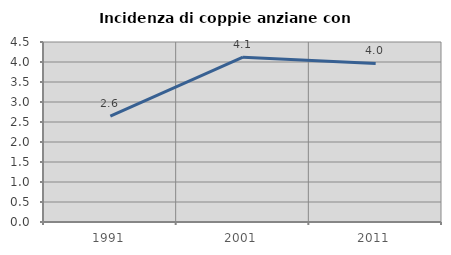
| Category | Incidenza di coppie anziane con figli |
|---|---|
| 1991.0 | 2.648 |
| 2001.0 | 4.12 |
| 2011.0 | 3.966 |